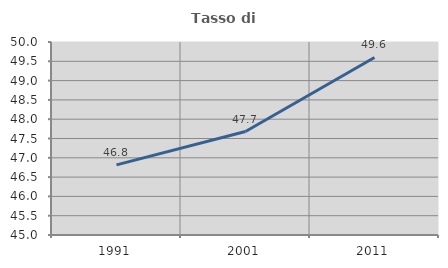
| Category | Tasso di occupazione   |
|---|---|
| 1991.0 | 46.817 |
| 2001.0 | 47.68 |
| 2011.0 | 49.6 |